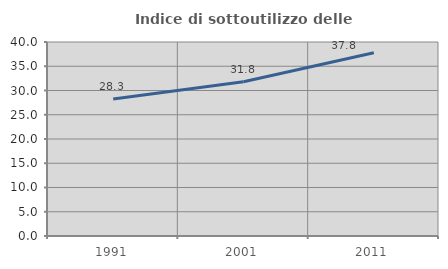
| Category | Indice di sottoutilizzo delle abitazioni  |
|---|---|
| 1991.0 | 28.266 |
| 2001.0 | 31.806 |
| 2011.0 | 37.776 |